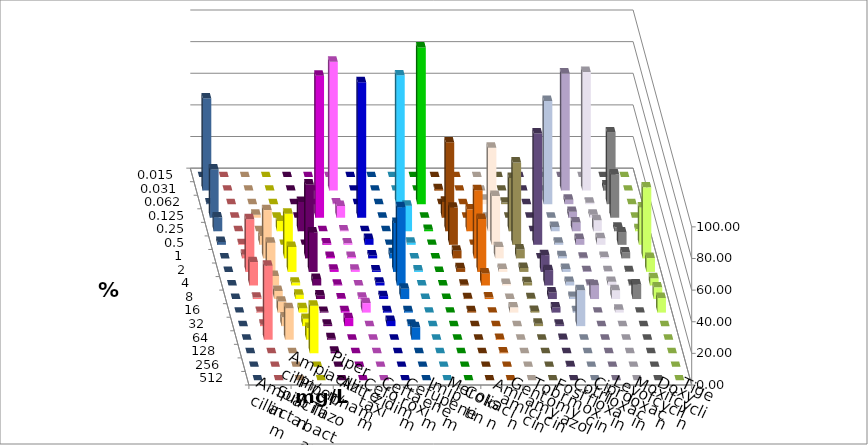
| Category | Ampicillin | Ampicillin/ Sulbactam | Piperacillin | Piperacillin/ Tazobactam | Aztreonam | Cefotaxim | Ceftazidim | Cefuroxim | Imipenem | Meropenem | Colistin | Amikacin | Gentamicin | Tobramycin | Fosfomycin | Cotrimoxazol | Ciprofloxacin | Levofloxacin | Moxifloxacin | Doxycyclin | Tigecyclin |
|---|---|---|---|---|---|---|---|---|---|---|---|---|---|---|---|---|---|---|---|---|---|
| 0.015 | 0 | 0 | 0 | 0 | 0 | 0 | 0 | 0 | 0 | 0 | 0 | 0 | 0 | 0 | 0 | 0 | 0 | 0 | 0 | 0 | 0 |
| 0.031 | 0 | 0 | 0 | 0 | 0 | 81.481 | 0 | 0 | 0 | 0 | 0.962 | 0 | 0 | 0 | 0 | 0 | 74.074 | 75 | 3.241 | 0 | 58.333 |
| 0.062 | 0 | 0 | 0 | 0 | 0 | 0.463 | 0 | 0 | 81.481 | 99.074 | 0 | 0 | 2.857 | 1.02 | 0 | 65.278 | 2.778 | 0.926 | 45.37 | 0 | 0.463 |
| 0.125 | 0 | 1.852 | 0 | 0 | 89.767 | 7.407 | 85.648 | 0 | 0 | 0 | 10.096 | 0 | 0 | 0 | 0 | 0 | 3.704 | 1.852 | 27.315 | 0 | 30.556 |
| 0.25 | 0 | 0 | 6.481 | 18.519 | 0 | 0.463 | 0 | 0 | 16.204 | 0.926 | 56.25 | 13.876 | 52.857 | 33.673 | 0 | 2.778 | 5.556 | 6.944 | 2.315 | 1.389 | 8.796 |
| 0.5 | 0.463 | 5.556 | 0 | 0 | 0.93 | 0.926 | 3.704 | 0 | 1.389 | 0 | 23.558 | 0 | 30.952 | 52.041 | 70.37 | 1.389 | 3.704 | 4.167 | 7.87 | 23.611 | 1.852 |
| 1.0 | 2.315 | 30.556 | 28.241 | 46.759 | 0.93 | 0.926 | 1.852 | 3.241 | 0 | 0 | 4.808 | 43.062 | 7.143 | 5.612 | 0 | 1.389 | 0.463 | 0.926 | 3.704 | 44.907 | 0 |
| 2.0 | 33.333 | 18.519 | 15.741 | 25 | 1.395 | 1.389 | 0.926 | 31.019 | 0.926 | 0 | 2.404 | 33.493 | 1.905 | 2.551 | 10.648 | 1.852 | 0.463 | 0.463 | 0.463 | 8.796 | 0 |
| 4.0 | 14.815 | 6.019 | 1.852 | 4.167 | 0.465 | 0 | 1.852 | 49.537 | 0 | 0 | 0.481 | 7.656 | 0.952 | 2.041 | 9.722 | 2.315 | 0.463 | 2.315 | 0.463 | 4.63 | 0 |
| 8.0 | 0.926 | 5.093 | 2.778 | 2.315 | 0.465 | 0.926 | 1.852 | 6.481 | 0 | 0 | 0.481 | 0.957 | 0 | 0.51 | 4.167 | 1.389 | 8.796 | 5.556 | 9.259 | 7.407 | 0 |
| 16.0 | 0.463 | 6.944 | 2.778 | 0.463 | 0.93 | 6.019 | 0.926 | 0.926 | 0 | 0 | 0.962 | 0 | 3.333 | 1.02 | 3.241 | 0.926 | 0 | 1.852 | 0 | 9.259 | 0 |
| 32.0 | 0.926 | 5.556 | 4.63 | 0.926 | 5.116 | 0 | 3.241 | 0.926 | 0 | 0 | 0 | 0 | 0 | 1.531 | 0.926 | 22.685 | 0 | 0 | 0 | 0 | 0 |
| 64.0 | 46.759 | 19.907 | 7.407 | 0.926 | 0 | 0 | 0 | 7.87 | 0 | 0 | 0 | 0.478 | 0 | 0 | 0.463 | 0 | 0 | 0 | 0 | 0 | 0 |
| 128.0 | 0 | 0 | 30.093 | 0.926 | 0 | 0 | 0 | 0 | 0 | 0 | 0 | 0.478 | 0 | 0 | 0 | 0 | 0 | 0 | 0 | 0 | 0 |
| 256.0 | 0 | 0 | 0 | 0 | 0 | 0 | 0 | 0 | 0 | 0 | 0 | 0 | 0 | 0 | 0.463 | 0 | 0 | 0 | 0 | 0 | 0 |
| 512.0 | 0 | 0 | 0 | 0 | 0 | 0 | 0 | 0 | 0 | 0 | 0 | 0 | 0 | 0 | 0 | 0 | 0 | 0 | 0 | 0 | 0 |